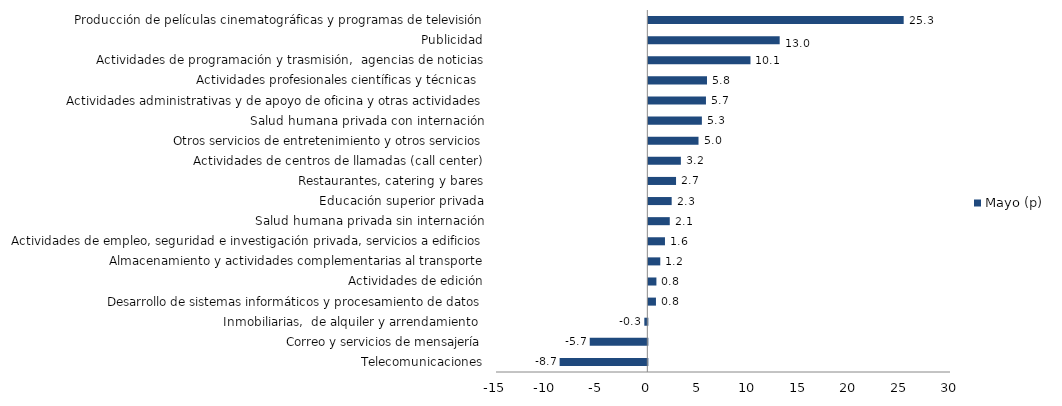
| Category | Mayo (p) |
|---|---|
| Telecomunicaciones | -8.695 |
| Correo y servicios de mensajería | -5.709 |
| Inmobiliarias,  de alquiler y arrendamiento  | -0.3 |
| Desarrollo de sistemas informáticos y procesamiento de datos | 0.756 |
| Actividades de edición | 0.8 |
| Almacenamiento y actividades complementarias al transporte | 1.184 |
| Actividades de empleo, seguridad e investigación privada, servicios a edificios | 1.649 |
| Salud humana privada sin internación | 2.124 |
| Educación superior privada | 2.314 |
| Restaurantes, catering y bares | 2.747 |
| Actividades de centros de llamadas (call center) | 3.224 |
| Otros servicios de entretenimiento y otros servicios | 4.974 |
| Salud humana privada con internación | 5.308 |
| Actividades administrativas y de apoyo de oficina y otras actividades | 5.712 |
| Actividades profesionales científicas y técnicas  | 5.815 |
| Actividades de programación y trasmisión,  agencias de noticias | 10.125 |
| Publicidad | 13.02 |
| Producción de películas cinematográficas y programas de televisión | 25.31 |